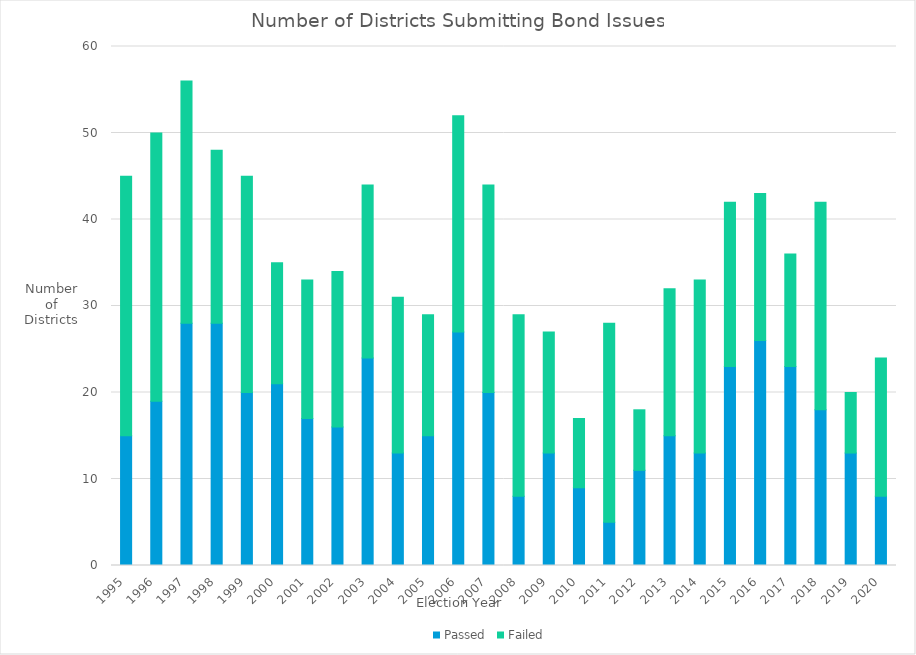
| Category | Passed | Failed |
|---|---|---|
| 1995 | 15 | 30 |
| 1996 | 19 | 31 |
| 1997 | 28 | 28 |
| 1998 | 28 | 20 |
| 1999 | 20 | 25 |
| 2000 | 21 | 14 |
| 2001 | 17 | 16 |
| 2002 | 16 | 18 |
| 2003 | 24 | 20 |
| 2004 | 13 | 18 |
| 2005 | 15 | 14 |
| 2006 | 27 | 25 |
| 2007 | 20 | 24 |
| 2008 | 8 | 21 |
| 2009 | 13 | 14 |
| 2010 | 9 | 8 |
| 2011 | 5 | 23 |
| 2012 | 11 | 7 |
| 2013 | 15 | 17 |
| 2014 | 13 | 20 |
| 2015 | 23 | 19 |
| 2016 | 26 | 17 |
| 2017 | 23 | 13 |
| 2018 | 18 | 24 |
| 2019 | 13 | 7 |
| 2020 | 8 | 16 |